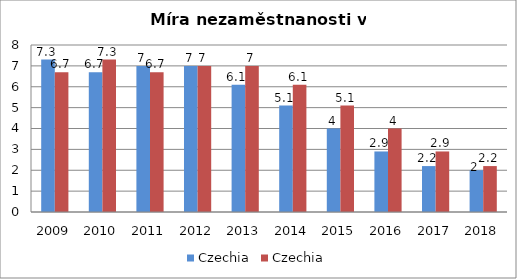
| Category | Czechia |
|---|---|
| 2009 | 6.7 |
| 2010 | 7.3 |
| 2011 | 6.7 |
| 2012 | 7 |
| 2013 | 7 |
| 2014 | 6.1 |
| 2015 | 5.1 |
| 2016 | 4 |
| 2017 | 2.9 |
| 2018 | 2.2 |